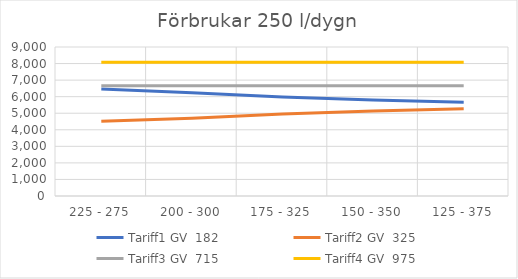
| Category | Tariff1 GV  | Tariff2 GV  | Tariff3 GV  | Tariff4 GV  |
|---|---|---|---|---|
| 225 - 275 | 6462.526 | 4520.571 | 6652.125 | 8075.625 |
| 200 - 300 | 6233.506 | 4699.767 | 6652.125 | 8075.625 |
| 175 - 325 | 5974.84 | 4951.207 | 6652.125 | 8075.625 |
| 150 - 350 | 5791.866 | 5137.275 | 6652.125 | 8075.625 |
| 125 - 375 | 5664.982 | 5267.634 | 6652.399 | 8075.625 |